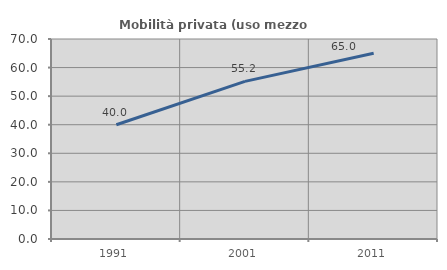
| Category | Mobilità privata (uso mezzo privato) |
|---|---|
| 1991.0 | 40 |
| 2001.0 | 55.176 |
| 2011.0 | 65.023 |